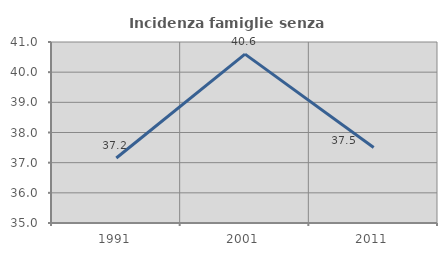
| Category | Incidenza famiglie senza nuclei |
|---|---|
| 1991.0 | 37.156 |
| 2001.0 | 40.598 |
| 2011.0 | 37.5 |